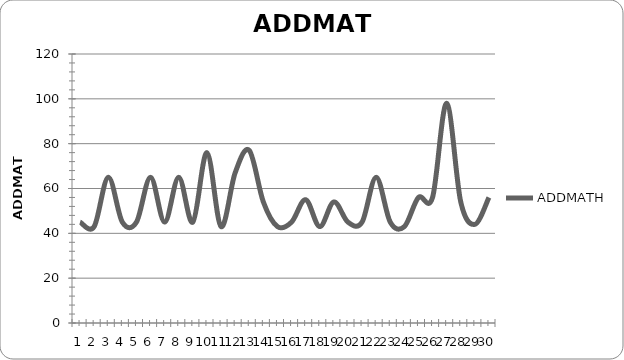
| Category | ADDMATH |
|---|---|
| 0 | 45 |
| 1 | 43 |
| 2 | 65 |
| 3 | 45 |
| 4 | 45 |
| 5 | 65 |
| 6 | 45 |
| 7 | 65 |
| 8 | 45 |
| 9 | 76 |
| 10 | 43 |
| 11 | 67 |
| 12 | 77 |
| 13 | 54 |
| 14 | 43 |
| 15 | 45 |
| 16 | 55 |
| 17 | 43 |
| 18 | 54 |
| 19 | 45 |
| 20 | 45 |
| 21 | 65 |
| 22 | 45 |
| 23 | 43 |
| 24 | 56 |
| 25 | 56 |
| 26 | 98 |
| 27 | 54 |
| 28 | 44 |
| 29 | 56 |